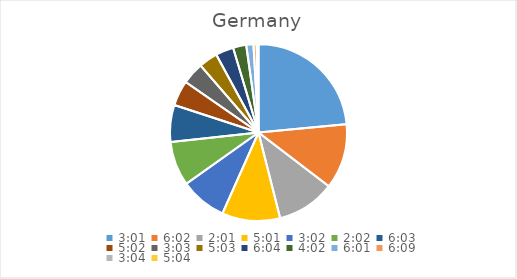
| Category | Series 0 |
|---|---|
| 0.12569444444444444 | 26.467 |
| 0.2513888888888889 | 13.394 |
| 0.08402777777777777 | 12.024 |
| 0.20902777777777778 | 11.957 |
| 0.12638888888888888 | 9.574 |
| 0.08472222222222221 | 9.123 |
| 0.2520833333333333 | 7.603 |
| 0.20972222222222223 | 5.221 |
| 0.12708333333333333 | 4.51 |
| 0.21041666666666667 | 3.866 |
| 0.25277777777777777 | 3.691 |
| 0.16805555555555554 | 2.715 |
| 0.25069444444444444 | 1.478 |
| 0.25625000000000003 | 0.651 |
| 0.1277777777777778 | 0.27 |
| 0.2111111111111111 | 0.108 |